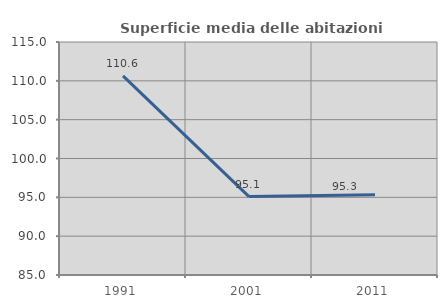
| Category | Superficie media delle abitazioni occupate |
|---|---|
| 1991.0 | 110.638 |
| 2001.0 | 95.101 |
| 2011.0 | 95.347 |